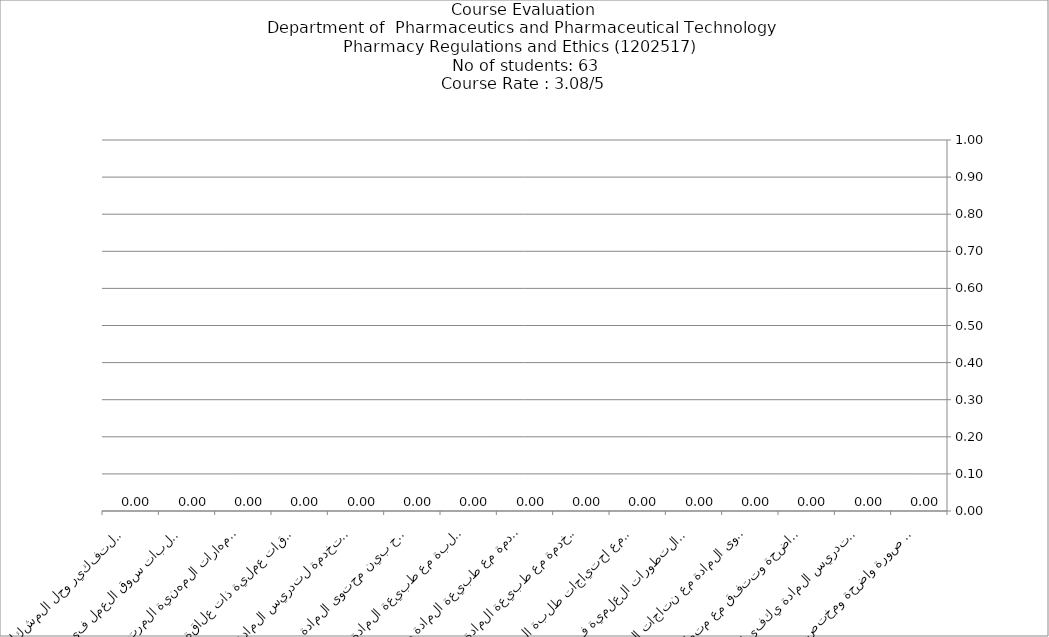
| Category | Series 0 | كلية الصيدلة-الجامعة الاردنية
الفصل الدراسي الثاني من العام الجامعي (2014/2015)
تحليل نتائج تقييم المواد |
|---|---|---|
| وصف المادة يعطي صورة واضحة ومختصرة لما تهدف إليه. | 0 |  |
| عدد ساعات تدريس المادة يكفي لتغطية محتواها. | 0 |  |
| نتاجات التعلم للمادة واضحة وتتفق مع متطلبات التخصص. | 0 |  |
| يتناسب محتوى المادة مع نتاجات التعلم المقصودة. | 0 |  |
| يواكب محتوى المادة التطورات العلمية في مجال التخصص. | 0 |  |
| يتناسب محتوى المادة مع احتياجات طلبة المستوى الدراسي. | 0 |  |
| تتناسب استراتيجيات وطرق التعليم المستخدمة مع طبيعة المادة ونتاجات تعلمها. | 0 |  |
|  تتناسب الوسائل التعليمية المستخدمة مع طبيعة المادة ونتاجات تعلمها.  | 0 |  |
| تتلاءم طرق تقييم الطلبة مع طبيعة المادة ونتاجات تعلمها. | 0 |  |
| يوجد ربط واضح بين محتوى المادة والحياة العملية.  | 0 |  |
| المراجع والكتب المستخدمة لتدريس المادة كافية وحديثة. | 0 |  |
| تتضمن المادة واجبات وتطبيقات عملية ذات علاقة وثيقة بالتخصص. | 0 |  |
| تساعد المادة على اكتساب المهارات المهنية المرتبطة بالتخصص. | 0 |  |
| ترتبط المادة بمتطلبات سوق العمل في مجال التخصص. | 0 |  |
| تساعد المادة على تنمية التفكير وحل المشكلات واتخاذ القرارات. | 0 |  |